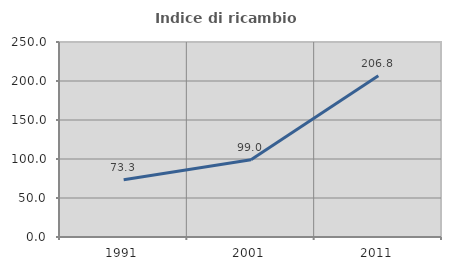
| Category | Indice di ricambio occupazionale  |
|---|---|
| 1991.0 | 73.31 |
| 2001.0 | 99.048 |
| 2011.0 | 206.818 |